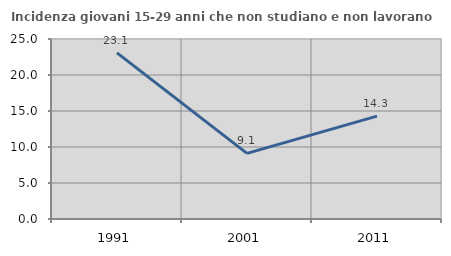
| Category | Incidenza giovani 15-29 anni che non studiano e non lavorano  |
|---|---|
| 1991.0 | 23.077 |
| 2001.0 | 9.114 |
| 2011.0 | 14.286 |